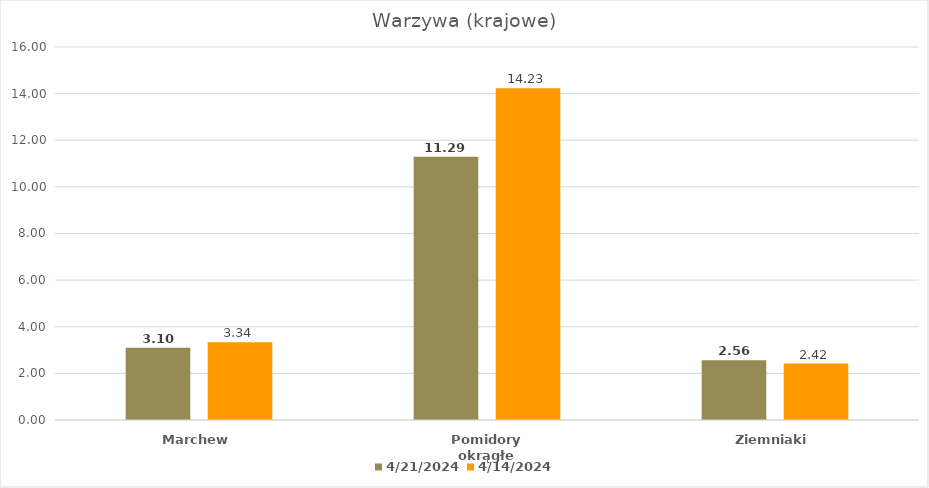
| Category | 2024-04-21 | 2024-04-14 |
|---|---|---|
| Marchew | 3.1 | 3.34 |
| Pomidory okrągłe | 11.29 | 14.23 |
| Ziemniaki | 2.56 | 2.42 |